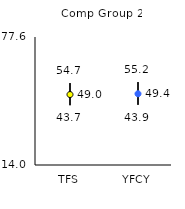
| Category | 25th | 75th | Mean |
|---|---|---|---|
| TFS | 43.7 | 54.7 | 49.01 |
| YFCY | 43.9 | 55.2 | 49.4 |